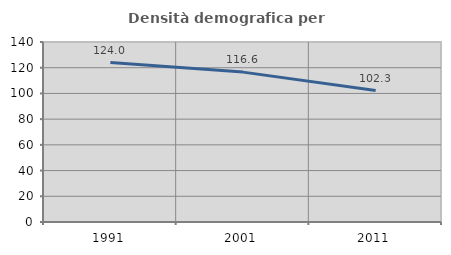
| Category | Densità demografica |
|---|---|
| 1991.0 | 124.038 |
| 2001.0 | 116.576 |
| 2011.0 | 102.267 |